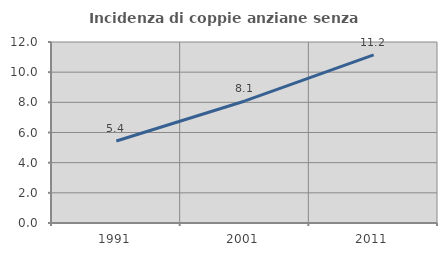
| Category | Incidenza di coppie anziane senza figli  |
|---|---|
| 1991.0 | 5.44 |
| 2001.0 | 8.092 |
| 2011.0 | 11.15 |